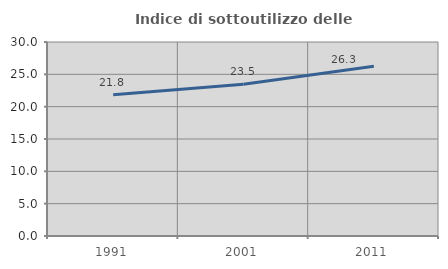
| Category | Indice di sottoutilizzo delle abitazioni  |
|---|---|
| 1991.0 | 21.828 |
| 2001.0 | 23.47 |
| 2011.0 | 26.265 |